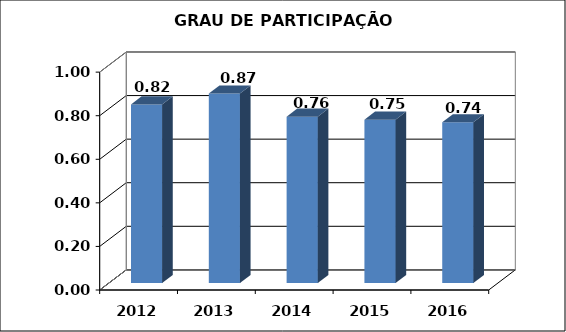
| Category | Series 0 |
|---|---|
| 2012.0 | 0.82 |
| 2013.0 | 0.87 |
| 2014.0 | 0.764 |
| 2015.0 | 0.75 |
| 2016.0 | 0.738 |